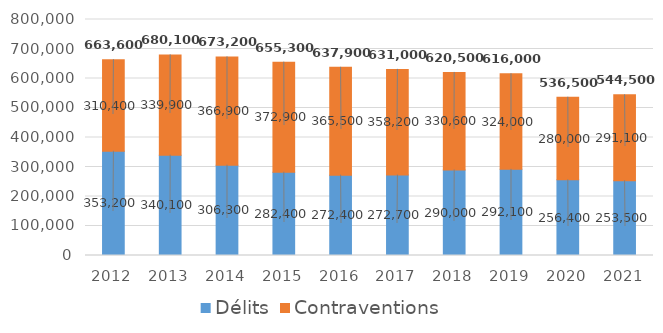
| Category | Délits | Contraventions |
|---|---|---|
| 2012.0 | 353200 | 310400 |
| 2013.0 | 340100 | 339900 |
| 2014.0 | 306300 | 366900 |
| 2015.0 | 282400 | 372900 |
| 2016.0 | 272400 | 365500 |
| 2017.0 | 272700 | 358200 |
| 2018.0 | 290000 | 330600 |
| 2019.0 | 292100 | 324000 |
| 2020.0 | 256400 | 280000 |
| 2021.0 | 253500 | 291100 |